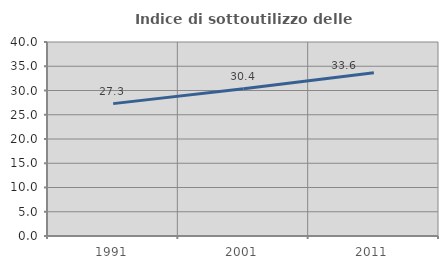
| Category | Indice di sottoutilizzo delle abitazioni  |
|---|---|
| 1991.0 | 27.293 |
| 2001.0 | 30.375 |
| 2011.0 | 33.647 |